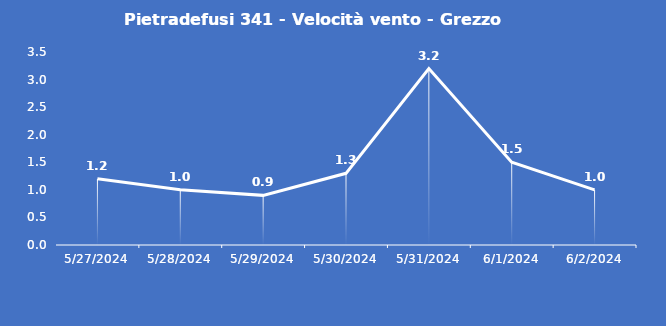
| Category | Pietradefusi 341 - Velocità vento - Grezzo (m/s) |
|---|---|
| 5/27/24 | 1.2 |
| 5/28/24 | 1 |
| 5/29/24 | 0.9 |
| 5/30/24 | 1.3 |
| 5/31/24 | 3.2 |
| 6/1/24 | 1.5 |
| 6/2/24 | 1 |